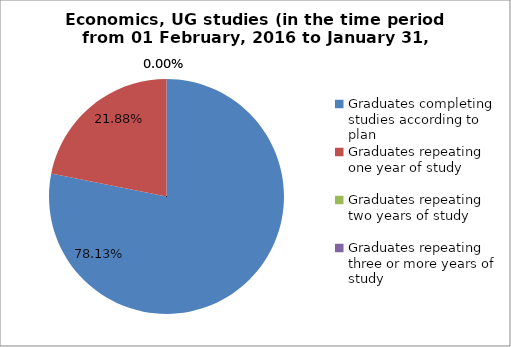
| Category | Series 0 |
|---|---|
| Graduates completing studies according to plan | 78.125 |
| Graduates repeating one year of study | 21.875 |
| Graduates repeating two years of study | 0 |
| Graduates repeating three or more years of study | 0 |